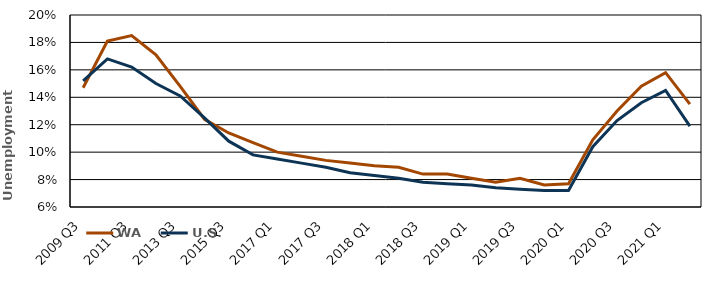
| Category | WA | U.S. |
|---|---|---|
| 2009 Q3 | 0.147 | 0.152 |
| 2010 Q3 | 0.181 | 0.168 |
| 2011 Q3 | 0.185 | 0.162 |
| 2012 Q3 | 0.171 | 0.15 |
| 2013 Q3 | 0.148 | 0.141 |
| 2014 Q3 | 0.124 | 0.125 |
| 2015 Q3 | 0.114 | 0.108 |
| 2016 Q3 | 0.107 | 0.098 |
| 2017 Q1 | 0.1 | 0.095 |
| 2017 Q2 | 0.097 | 0.092 |
| 2017 Q3 | 0.094 | 0.089 |
| 2017 Annual | 0.092 | 0.085 |
| 2018 Q1 | 0.09 | 0.083 |
| 2018 Q2 | 0.089 | 0.081 |
| 2018 Q3 | 0.084 | 0.078 |
| 2018 Annual | 0.084 | 0.077 |
| 2019 Q1 | 0.081 | 0.076 |
| 2019 Q2 | 0.078 | 0.074 |
| 2019 Q3 | 0.081 | 0.073 |
| 2019 Annual | 0.076 | 0.072 |
| 2020 Q1 | 0.077 | 0.072 |
| 2020 Q2 | 0.109 | 0.104 |
| 2020 Q3 | 0.13 | 0.123 |
| 2020 Annual | 0.148 | 0.136 |
| 2021 Q1 | 0.158 | 0.145 |
| 2021 Q2 | 0.135 | 0.119 |